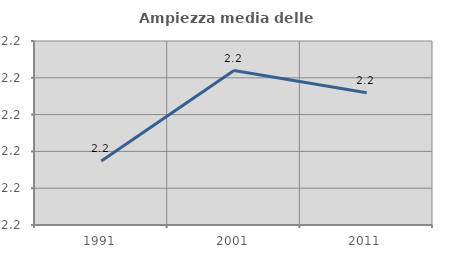
| Category | Ampiezza media delle famiglie |
|---|---|
| 1991.0 | 2.224 |
| 2001.0 | 2.236 |
| 2011.0 | 2.233 |